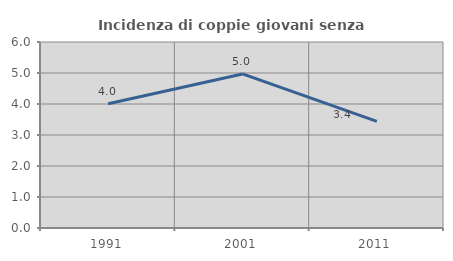
| Category | Incidenza di coppie giovani senza figli |
|---|---|
| 1991.0 | 4.009 |
| 2001.0 | 4.969 |
| 2011.0 | 3.439 |